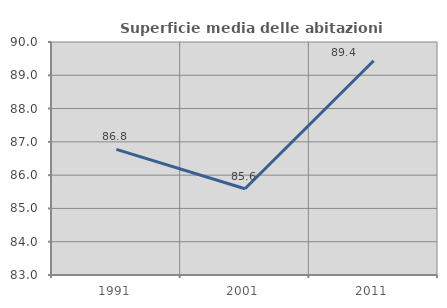
| Category | Superficie media delle abitazioni occupate |
|---|---|
| 1991.0 | 86.775 |
| 2001.0 | 85.59 |
| 2011.0 | 89.437 |